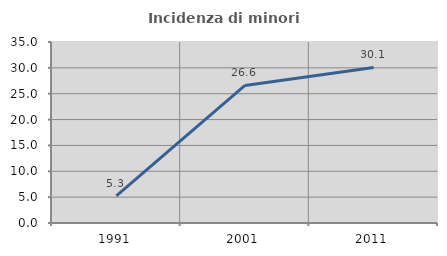
| Category | Incidenza di minori stranieri |
|---|---|
| 1991.0 | 5.263 |
| 2001.0 | 26.601 |
| 2011.0 | 30.074 |